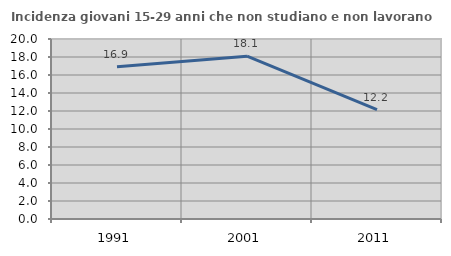
| Category | Incidenza giovani 15-29 anni che non studiano e non lavorano  |
|---|---|
| 1991.0 | 16.917 |
| 2001.0 | 18.095 |
| 2011.0 | 12.162 |